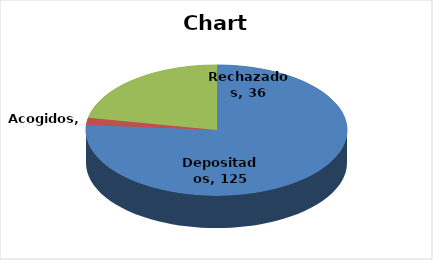
| Category | Series 0 |
|---|---|
| Depositados | 125 |
| Acogidos | 3 |
| Rechazados | 36 |